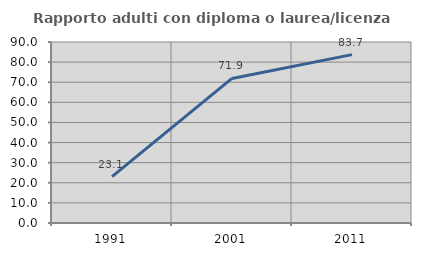
| Category | Rapporto adulti con diploma o laurea/licenza media  |
|---|---|
| 1991.0 | 23.051 |
| 2001.0 | 71.875 |
| 2011.0 | 83.721 |